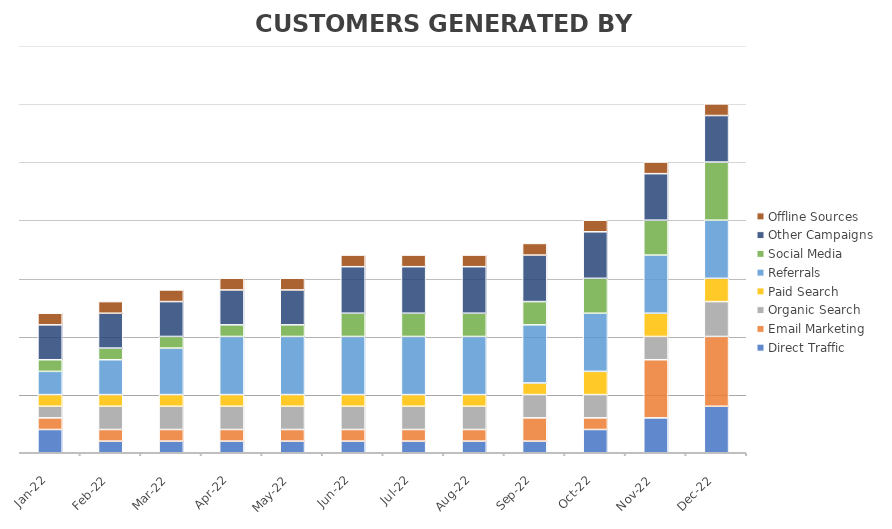
| Category | Direct Traffic | Email Marketing | Organic Search | Paid Search | Referrals | Social Media | Other Campaigns | Offline Sources |
|---|---|---|---|---|---|---|---|---|
| 2022-01-18 | 2 | 1 | 1 | 1 | 2 | 1 | 3 | 1 |
| 2022-02-18 | 1 | 1 | 2 | 1 | 3 | 1 | 3 | 1 |
| 2022-03-18 | 1 | 1 | 2 | 1 | 4 | 1 | 3 | 1 |
| 2022-04-18 | 1 | 1 | 2 | 1 | 5 | 1 | 3 | 1 |
| 2022-05-18 | 1 | 1 | 2 | 1 | 5 | 1 | 3 | 1 |
| 2022-06-18 | 1 | 1 | 2 | 1 | 5 | 2 | 4 | 1 |
| 2022-07-18 | 1 | 1 | 2 | 1 | 5 | 2 | 4 | 1 |
| 2022-08-18 | 1 | 1 | 2 | 1 | 5 | 2 | 4 | 1 |
| 2022-09-18 | 1 | 2 | 2 | 1 | 5 | 2 | 4 | 1 |
| 2022-10-18 | 2 | 1 | 2 | 2 | 5 | 3 | 4 | 1 |
| 2022-11-18 | 3 | 5 | 2 | 2 | 5 | 3 | 4 | 1 |
| 2022-12-18 | 4 | 6 | 3 | 2 | 5 | 5 | 4 | 1 |